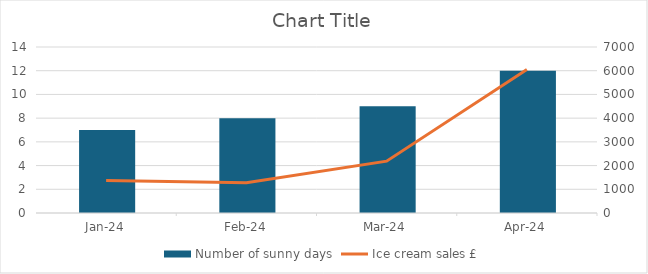
| Category | Number of sunny days |
|---|---|
| 2024-01-01 | 7 |
| 2024-02-01 | 8 |
| 2024-03-01 | 9 |
| 2024-04-01 | 12 |